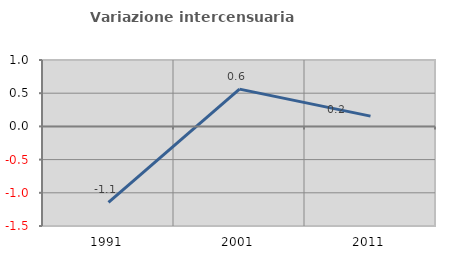
| Category | Variazione intercensuaria annua |
|---|---|
| 1991.0 | -1.145 |
| 2001.0 | 0.562 |
| 2011.0 | 0.155 |